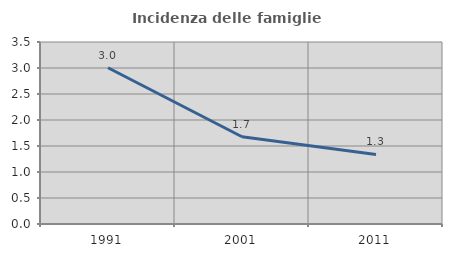
| Category | Incidenza delle famiglie numerose |
|---|---|
| 1991.0 | 3.005 |
| 2001.0 | 1.677 |
| 2011.0 | 1.337 |